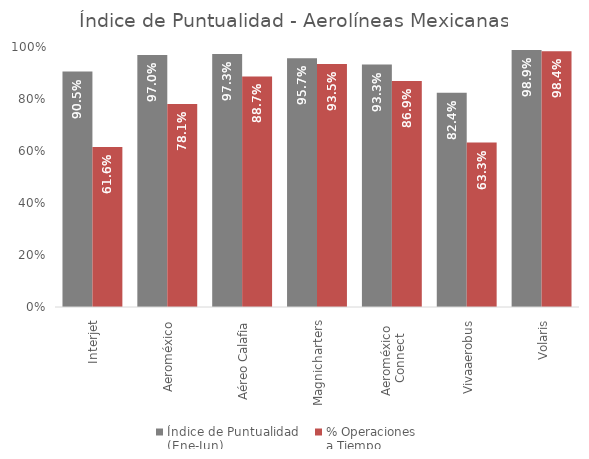
| Category | Índice de Puntualidad
(Ene-Jun) | % Operaciones 
a Tiempo |
|---|---|---|
| Interjet | 0.905 | 0.616 |
| Aeroméxico | 0.97 | 0.781 |
| Aéreo Calafia | 0.973 | 0.887 |
| Magnicharters | 0.957 | 0.935 |
| Aeroméxico 
Connect | 0.933 | 0.869 |
| Vivaaerobus | 0.824 | 0.633 |
| Volaris | 0.989 | 0.984 |